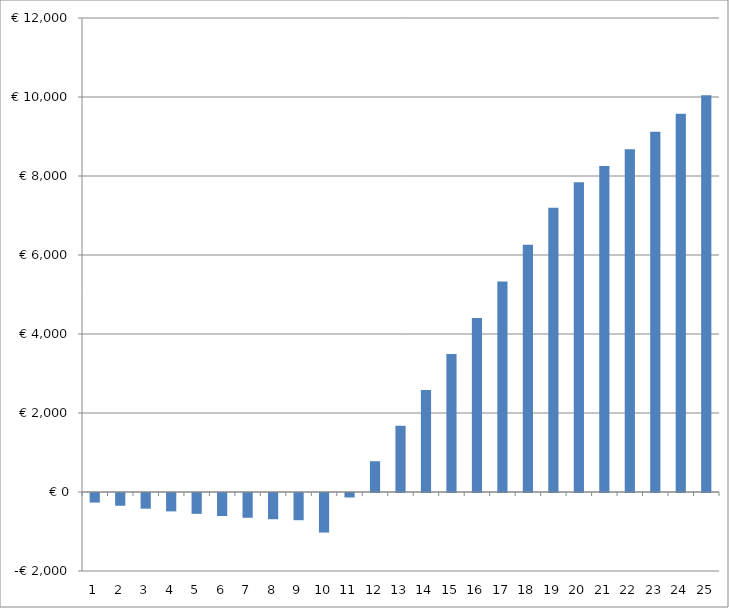
| Category | Series 0 |
|---|---|
| 0 | -242.575 |
| 1 | -322.096 |
| 2 | -396.728 |
| 3 | -465.589 |
| 4 | -527.746 |
| 5 | -582.211 |
| 6 | -627.936 |
| 7 | -663.813 |
| 8 | -688.667 |
| 9 | -1001.253 |
| 10 | -113.465 |
| 11 | 779.296 |
| 12 | 1677.342 |
| 13 | 2580.99 |
| 14 | 3490.566 |
| 15 | 4406.4 |
| 16 | 5328.831 |
| 17 | 6258.203 |
| 18 | 7194.871 |
| 19 | 7839.193 |
| 20 | 8253.103 |
| 21 | 8680.256 |
| 22 | 9120.993 |
| 23 | 9575.664 |
| 24 | 10044.626 |